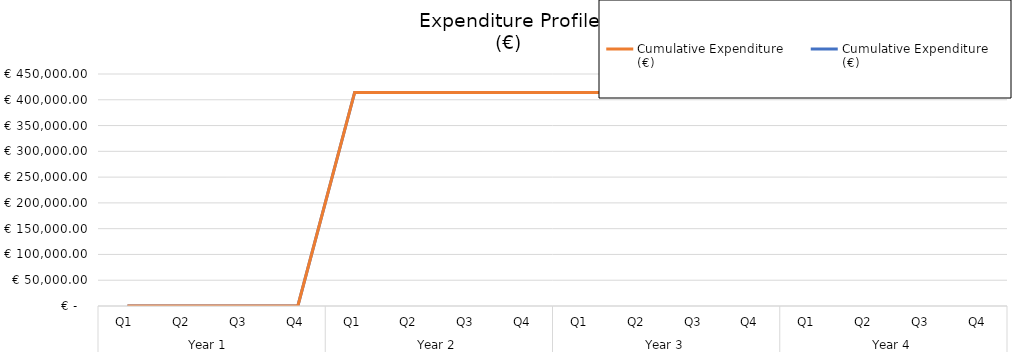
| Category | Cumulative Expenditure 
(€) |
|---|---|
| 0 | 0 |
| 1 | 0 |
| 2 | 0 |
| 3 | 0 |
| 4 | 0 |
| 5 | 0 |
| 6 | 0 |
| 7 | 0 |
| 8 | 0 |
| 9 | 0 |
| 10 | 0 |
| 11 | 0 |
| 12 | 0 |
| 13 | 0 |
| 14 | 0 |
| 15 | 0 |